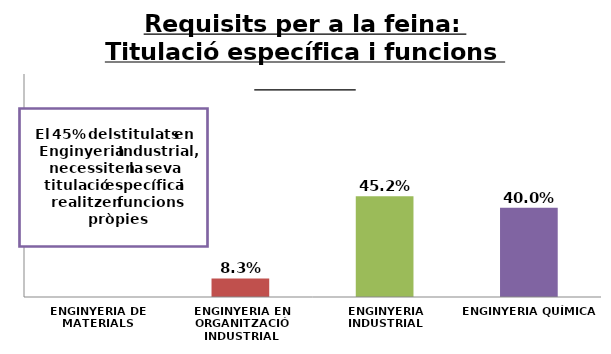
| Category | Series 2 |
|---|---|
| ENGINYERIA DE MATERIALS | 0 |
| ENGINYERIA EN ORGANITZACIÓ INDUSTRIAL | 0.083 |
| ENGINYERIA INDUSTRIAL | 0.452 |
| ENGINYERIA QUÍMICA | 0.4 |